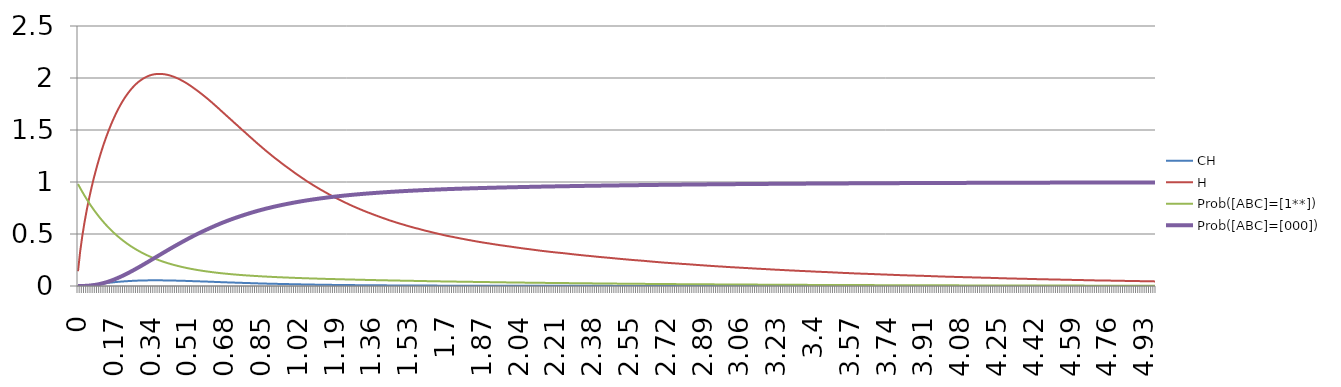
| Category | CH | H | Prob([ABC]=[1**]) | Prob([ABC]=[000]) |
|---|---|---|---|---|
| 0 | 0 | 0.142 | 0.98 | 0 |
| 0,01 | 0.001 | 0.332 | 0.942 | 0 |
| 0,02 | 0.002 | 0.482 | 0.905 | 0 |
| 0,03 | 0.004 | 0.611 | 0.87 | 0.001 |
| 0,04 | 0.005 | 0.726 | 0.836 | 0.002 |
| 0,05 | 0.008 | 0.829 | 0.803 | 0.003 |
| 0,06 | 0.01 | 0.924 | 0.772 | 0.005 |
| 0,07 | 0.012 | 1.012 | 0.742 | 0.008 |
| 0,08 | 0.015 | 1.093 | 0.713 | 0.011 |
| 0,09 | 0.018 | 1.169 | 0.685 | 0.015 |
| 0,1 | 0.02 | 1.241 | 0.659 | 0.019 |
| 0,11 | 0.023 | 1.308 | 0.634 | 0.024 |
| 0,12 | 0.025 | 1.371 | 0.61 | 0.029 |
| 0,13 | 0.028 | 1.43 | 0.586 | 0.035 |
| 0,14 | 0.03 | 1.486 | 0.564 | 0.042 |
| 0,15 | 0.033 | 1.539 | 0.543 | 0.049 |
| 0,16 | 0.035 | 1.588 | 0.523 | 0.057 |
| 0,17 | 0.037 | 1.634 | 0.503 | 0.065 |
| 0,18 | 0.039 | 1.677 | 0.484 | 0.074 |
| 0,19 | 0.041 | 1.718 | 0.467 | 0.083 |
| 0,2 | 0.043 | 1.755 | 0.45 | 0.092 |
| 0,21 | 0.044 | 1.79 | 0.433 | 0.102 |
| 0,22 | 0.046 | 1.822 | 0.418 | 0.112 |
| 0,23 | 0.047 | 1.851 | 0.403 | 0.123 |
| 0,24 | 0.048 | 1.878 | 0.389 | 0.134 |
| 0,25 | 0.049 | 1.903 | 0.375 | 0.145 |
| 0,26 | 0.05 | 1.926 | 0.362 | 0.156 |
| 0,27 | 0.051 | 1.946 | 0.349 | 0.168 |
| 0,28 | 0.052 | 1.964 | 0.338 | 0.179 |
| 0,29 | 0.052 | 1.979 | 0.326 | 0.191 |
| 0,3 | 0.053 | 1.993 | 0.315 | 0.203 |
| 0,31 | 0.054 | 2.005 | 0.305 | 0.215 |
| 0,32 | 0.054 | 2.015 | 0.295 | 0.228 |
| 0,33 | 0.054 | 2.023 | 0.285 | 0.24 |
| 0,34 | 0.054 | 2.03 | 0.276 | 0.252 |
| 0,35 | 0.055 | 2.035 | 0.267 | 0.265 |
| 0,36 | 0.054 | 2.038 | 0.259 | 0.277 |
| 0,37 | 0.054 | 2.039 | 0.251 | 0.29 |
| 0,38 | 0.054 | 2.039 | 0.244 | 0.302 |
| 0,39 | 0.054 | 2.038 | 0.236 | 0.314 |
| 0,4 | 0.054 | 2.036 | 0.229 | 0.327 |
| 0,41 | 0.054 | 2.032 | 0.223 | 0.339 |
| 0,42 | 0.053 | 2.027 | 0.216 | 0.351 |
| 0,43 | 0.053 | 2.021 | 0.21 | 0.363 |
| 0,44 | 0.052 | 2.014 | 0.204 | 0.375 |
| 0,45 | 0.052 | 2.005 | 0.199 | 0.387 |
| 0,46 | 0.051 | 1.997 | 0.193 | 0.399 |
| 0,47 | 0.051 | 1.986 | 0.188 | 0.41 |
| 0,48 | 0.05 | 1.976 | 0.183 | 0.422 |
| 0,49 | 0.05 | 1.964 | 0.179 | 0.433 |
| 0,5 | 0.049 | 1.952 | 0.174 | 0.444 |
| 0,51 | 0.048 | 1.938 | 0.17 | 0.456 |
| 0,52 | 0.048 | 1.925 | 0.166 | 0.467 |
| 0,53 | 0.047 | 1.91 | 0.162 | 0.478 |
| 0,54 | 0.046 | 1.895 | 0.158 | 0.488 |
| 0,55 | 0.046 | 1.88 | 0.154 | 0.498 |
| 0,56 | 0.045 | 1.864 | 0.151 | 0.509 |
| 0,57 | 0.044 | 1.848 | 0.148 | 0.519 |
| 0,58 | 0.043 | 1.831 | 0.144 | 0.529 |
| 0,59 | 0.043 | 1.815 | 0.142 | 0.538 |
| 0,6 | 0.042 | 1.798 | 0.139 | 0.548 |
| 0,61 | 0.041 | 1.78 | 0.136 | 0.557 |
| 0,62 | 0.04 | 1.762 | 0.133 | 0.566 |
| 0,63 | 0.04 | 1.743 | 0.13 | 0.576 |
| 0,64 | 0.039 | 1.725 | 0.128 | 0.585 |
| 0,65 | 0.038 | 1.706 | 0.126 | 0.593 |
| 0,66 | 0.037 | 1.687 | 0.123 | 0.602 |
| 0,67 | 0.036 | 1.668 | 0.121 | 0.611 |
| 0,68 | 0.036 | 1.65 | 0.119 | 0.619 |
| 0,69 | 0.035 | 1.63 | 0.117 | 0.627 |
| 0,7 | 0.034 | 1.612 | 0.115 | 0.635 |
| 0,71 | 0.034 | 1.593 | 0.113 | 0.642 |
| 0,72 | 0.033 | 1.574 | 0.111 | 0.65 |
| 0,73 | 0.032 | 1.555 | 0.11 | 0.657 |
| 0,74 | 0.032 | 1.537 | 0.108 | 0.664 |
| 0,75 | 0.031 | 1.517 | 0.106 | 0.671 |
| 0,76 | 0.03 | 1.499 | 0.105 | 0.678 |
| 0,77 | 0.029 | 1.48 | 0.103 | 0.685 |
| 0,78 | 0.029 | 1.462 | 0.102 | 0.691 |
| 0,79 | 0.028 | 1.442 | 0.1 | 0.698 |
| 0,8 | 0.027 | 1.424 | 0.099 | 0.704 |
| 0,81 | 0.027 | 1.406 | 0.098 | 0.71 |
| 0,82 | 0.026 | 1.387 | 0.096 | 0.717 |
| 0,83 | 0.025 | 1.368 | 0.095 | 0.723 |
| 0,84 | 0.025 | 1.351 | 0.094 | 0.728 |
| 0,85 | 0.024 | 1.333 | 0.093 | 0.734 |
| 0,86 | 0.024 | 1.315 | 0.091 | 0.739 |
| 0,87 | 0.023 | 1.297 | 0.09 | 0.745 |
| 0,88 | 0.022 | 1.281 | 0.089 | 0.75 |
| 0,89 | 0.022 | 1.264 | 0.088 | 0.755 |
| 0,9 | 0.021 | 1.246 | 0.087 | 0.76 |
| 0,91 | 0.021 | 1.23 | 0.086 | 0.765 |
| 0,92 | 0.02 | 1.214 | 0.085 | 0.769 |
| 0,93 | 0.02 | 1.198 | 0.084 | 0.774 |
| 0,94 | 0.02 | 1.182 | 0.083 | 0.778 |
| 0,95 | 0.019 | 1.166 | 0.082 | 0.783 |
| 0,96 | 0.019 | 1.151 | 0.082 | 0.787 |
| 0,97 | 0.018 | 1.136 | 0.081 | 0.791 |
| 0,98 | 0.018 | 1.12 | 0.08 | 0.795 |
| 0,99 | 0.017 | 1.105 | 0.079 | 0.799 |
| 1 | 0.017 | 1.09 | 0.078 | 0.803 |
| 1,01 | 0.016 | 1.075 | 0.078 | 0.807 |
| 1,02 | 0.016 | 1.061 | 0.077 | 0.81 |
| 1,03 | 0.016 | 1.046 | 0.076 | 0.814 |
| 1,04 | 0.015 | 1.032 | 0.075 | 0.817 |
| 1,05 | 0.015 | 1.018 | 0.074 | 0.821 |
| 1,06 | 0.014 | 1.004 | 0.074 | 0.824 |
| 1,07 | 0.014 | 0.992 | 0.073 | 0.827 |
| 1,08 | 0.014 | 0.978 | 0.072 | 0.83 |
| 1,09 | 0.013 | 0.965 | 0.072 | 0.834 |
| 1,1 | 0.013 | 0.953 | 0.071 | 0.836 |
| 1,11 | 0.013 | 0.94 | 0.071 | 0.839 |
| 1,12 | 0.012 | 0.928 | 0.07 | 0.842 |
| 1,13 | 0.012 | 0.916 | 0.069 | 0.845 |
| 1,14 | 0.012 | 0.904 | 0.069 | 0.848 |
| 1,15 | 0.012 | 0.893 | 0.068 | 0.85 |
| 1,16 | 0.011 | 0.881 | 0.068 | 0.853 |
| 1,17 | 0.011 | 0.87 | 0.067 | 0.855 |
| 1,18 | 0.011 | 0.858 | 0.066 | 0.858 |
| 1,19 | 0.01 | 0.847 | 0.066 | 0.86 |
| 1,2 | 0.01 | 0.837 | 0.065 | 0.863 |
| 1,21 | 0.01 | 0.827 | 0.065 | 0.865 |
| 1,22 | 0.01 | 0.816 | 0.064 | 0.867 |
| 1,23 | 0.009 | 0.806 | 0.064 | 0.869 |
| 1,24 | 0.009 | 0.797 | 0.063 | 0.871 |
| 1,25 | 0.009 | 0.787 | 0.063 | 0.873 |
| 1,26 | 0.009 | 0.777 | 0.062 | 0.875 |
| 1,27 | 0.009 | 0.768 | 0.062 | 0.877 |
| 1,28 | 0.008 | 0.759 | 0.061 | 0.879 |
| 1,29 | 0.008 | 0.75 | 0.061 | 0.881 |
| 1,3 | 0.008 | 0.741 | 0.06 | 0.883 |
| 1,31 | 0.008 | 0.732 | 0.06 | 0.885 |
| 1,32 | 0.008 | 0.724 | 0.059 | 0.886 |
| 1,33 | 0.007 | 0.715 | 0.059 | 0.888 |
| 1,34 | 0.007 | 0.707 | 0.058 | 0.89 |
| 1,35 | 0.007 | 0.699 | 0.058 | 0.891 |
| 1,36 | 0.007 | 0.691 | 0.057 | 0.893 |
| 1,37 | 0.007 | 0.683 | 0.057 | 0.894 |
| 1,38 | 0.007 | 0.675 | 0.056 | 0.896 |
| 1,39 | 0.007 | 0.668 | 0.056 | 0.897 |
| 1,4 | 0.006 | 0.66 | 0.056 | 0.899 |
| 1,41 | 0.006 | 0.653 | 0.055 | 0.9 |
| 1,42 | 0.006 | 0.646 | 0.055 | 0.902 |
| 1,43 | 0.006 | 0.638 | 0.054 | 0.903 |
| 1,44 | 0.006 | 0.631 | 0.054 | 0.905 |
| 1,45 | 0.006 | 0.624 | 0.053 | 0.906 |
| 1,46 | 0.006 | 0.618 | 0.053 | 0.907 |
| 1,47 | 0.006 | 0.611 | 0.052 | 0.908 |
| 1,48 | 0.005 | 0.604 | 0.052 | 0.91 |
| 1,49 | 0.005 | 0.598 | 0.052 | 0.911 |
| 1,5 | 0.005 | 0.592 | 0.051 | 0.912 |
| 1,51 | 0.005 | 0.586 | 0.051 | 0.913 |
| 1,52 | 0.005 | 0.58 | 0.05 | 0.914 |
| 1,53 | 0.005 | 0.574 | 0.05 | 0.915 |
| 1,54 | 0.005 | 0.568 | 0.05 | 0.916 |
| 1,55 | 0.004 | 0.562 | 0.049 | 0.917 |
| 1,56 | 0.004 | 0.556 | 0.049 | 0.918 |
| 1,57 | 0.004 | 0.552 | 0.048 | 0.919 |
| 1,58 | 0.004 | 0.546 | 0.048 | 0.92 |
| 1,59 | 0.004 | 0.54 | 0.048 | 0.921 |
| 1,6 | 0.004 | 0.534 | 0.047 | 0.922 |
| 1,61 | 0.004 | 0.529 | 0.047 | 0.923 |
| 1,62 | 0.004 | 0.524 | 0.046 | 0.924 |
| 1,63 | 0.004 | 0.52 | 0.046 | 0.925 |
| 1,64 | 0.004 | 0.514 | 0.046 | 0.926 |
| 1,65 | 0.004 | 0.509 | 0.045 | 0.927 |
| 1,66 | 0.004 | 0.504 | 0.045 | 0.928 |
| 1,67 | 0.004 | 0.499 | 0.045 | 0.929 |
| 1,68 | 0.004 | 0.495 | 0.044 | 0.929 |
| 1,69 | 0.003 | 0.49 | 0.044 | 0.93 |
| 1,7 | 0.003 | 0.485 | 0.044 | 0.931 |
| 1,71 | 0.003 | 0.48 | 0.043 | 0.932 |
| 1,72 | 0.003 | 0.476 | 0.043 | 0.932 |
| 1,73 | 0.003 | 0.472 | 0.043 | 0.933 |
| 1,74 | 0.003 | 0.468 | 0.042 | 0.934 |
| 1,75 | 0.003 | 0.464 | 0.042 | 0.935 |
| 1,76 | 0.003 | 0.46 | 0.042 | 0.935 |
| 1,77 | 0.003 | 0.456 | 0.041 | 0.936 |
| 1,78 | 0.003 | 0.452 | 0.041 | 0.937 |
| 1,79 | 0.003 | 0.448 | 0.041 | 0.937 |
| 1,8 | 0.003 | 0.444 | 0.04 | 0.938 |
| 1,81 | 0.003 | 0.44 | 0.04 | 0.939 |
| 1,82 | 0.003 | 0.436 | 0.04 | 0.939 |
| 1,83 | 0.003 | 0.433 | 0.04 | 0.94 |
| 1,84 | 0.003 | 0.429 | 0.039 | 0.941 |
| 1,85 | 0.003 | 0.425 | 0.039 | 0.941 |
| 1,86 | 0.002 | 0.422 | 0.039 | 0.942 |
| 1,87 | 0.002 | 0.418 | 0.038 | 0.942 |
| 1,88 | 0.002 | 0.415 | 0.038 | 0.943 |
| 1,89 | 0.002 | 0.412 | 0.038 | 0.944 |
| 1,9 | 0.002 | 0.409 | 0.037 | 0.944 |
| 1,91 | 0.002 | 0.405 | 0.037 | 0.945 |
| 1,92 | 0.002 | 0.402 | 0.037 | 0.945 |
| 1,93 | 0.002 | 0.399 | 0.036 | 0.946 |
| 1,94 | 0.002 | 0.396 | 0.036 | 0.946 |
| 1,95 | 0.002 | 0.392 | 0.036 | 0.947 |
| 1,96 | 0.002 | 0.39 | 0.035 | 0.947 |
| 1,97 | 0.002 | 0.387 | 0.035 | 0.948 |
| 1,98 | 0.002 | 0.384 | 0.035 | 0.948 |
| 1,99 | 0.002 | 0.381 | 0.034 | 0.949 |
| 2 | 0.002 | 0.378 | 0.034 | 0.949 |
| 2,01 | 0.002 | 0.375 | 0.034 | 0.95 |
| 2,02 | 0.002 | 0.372 | 0.034 | 0.95 |
| 2,03 | 0.002 | 0.369 | 0.033 | 0.951 |
| 2,04 | 0.002 | 0.366 | 0.033 | 0.951 |
| 2,05 | 0.002 | 0.363 | 0.033 | 0.952 |
| 2,06 | 0.002 | 0.36 | 0.032 | 0.952 |
| 2,07 | 0.002 | 0.358 | 0.032 | 0.952 |
| 2,08 | 0.002 | 0.355 | 0.032 | 0.953 |
| 2,09 | 0.002 | 0.352 | 0.032 | 0.953 |
| 2,1 | 0.002 | 0.35 | 0.032 | 0.954 |
| 2,11 | 0.002 | 0.347 | 0.031 | 0.954 |
| 2,12 | 0.002 | 0.344 | 0.031 | 0.955 |
| 2,13 | 0.002 | 0.341 | 0.031 | 0.955 |
| 2,14 | 0.002 | 0.339 | 0.03 | 0.956 |
| 2,15 | 0.002 | 0.336 | 0.03 | 0.956 |
| 2,16 | 0.002 | 0.334 | 0.03 | 0.956 |
| 2,17 | 0.002 | 0.331 | 0.03 | 0.957 |
| 2,18 | 0.002 | 0.329 | 0.03 | 0.957 |
| 2,19 | 0.002 | 0.327 | 0.029 | 0.957 |
| 2,2 | 0.002 | 0.324 | 0.029 | 0.958 |
| 2,21 | 0.002 | 0.322 | 0.029 | 0.958 |
| 2,22 | 0.002 | 0.32 | 0.029 | 0.958 |
| 2,23 | 0.002 | 0.318 | 0.028 | 0.959 |
| 2,24 | 0.002 | 0.316 | 0.028 | 0.959 |
| 2,25 | 0.002 | 0.314 | 0.028 | 0.96 |
| 2,26 | 0.002 | 0.312 | 0.028 | 0.96 |
| 2,27 | 0.002 | 0.309 | 0.028 | 0.96 |
| 2,28 | 0.002 | 0.307 | 0.027 | 0.961 |
| 2,29 | 0.002 | 0.304 | 0.027 | 0.961 |
| 2,3 | 0.002 | 0.302 | 0.027 | 0.961 |
| 2,31 | 0.002 | 0.3 | 0.027 | 0.962 |
| 2,32 | 0.001 | 0.298 | 0.026 | 0.962 |
| 2,33 | 0.001 | 0.296 | 0.026 | 0.962 |
| 2,34 | 0.001 | 0.293 | 0.026 | 0.963 |
| 2,35 | 0.001 | 0.291 | 0.026 | 0.963 |
| 2,36 | 0.001 | 0.29 | 0.026 | 0.963 |
| 2,37 | 0.001 | 0.288 | 0.025 | 0.964 |
| 2,38 | 0.001 | 0.285 | 0.025 | 0.964 |
| 2,39 | 0.001 | 0.283 | 0.025 | 0.964 |
| 2,4 | 0.001 | 0.281 | 0.025 | 0.965 |
| 2,41 | 0.001 | 0.279 | 0.024 | 0.965 |
| 2,42 | 0.001 | 0.277 | 0.024 | 0.965 |
| 2,43 | 0.001 | 0.275 | 0.024 | 0.965 |
| 2,44 | 0.001 | 0.274 | 0.024 | 0.966 |
| 2,45 | 0.001 | 0.272 | 0.024 | 0.966 |
| 2,46 | 0.001 | 0.27 | 0.023 | 0.966 |
| 2,47 | 0.001 | 0.268 | 0.023 | 0.967 |
| 2,48 | 0.001 | 0.266 | 0.023 | 0.967 |
| 2,49 | 0.001 | 0.264 | 0.023 | 0.967 |
| 2,5 | 0.001 | 0.262 | 0.023 | 0.968 |
| 2,51 | 0.001 | 0.26 | 0.022 | 0.968 |
| 2,52 | 0.001 | 0.258 | 0.022 | 0.968 |
| 2,53 | 0.001 | 0.256 | 0.022 | 0.968 |
| 2,54 | 0.001 | 0.254 | 0.022 | 0.969 |
| 2,55 | 0.001 | 0.252 | 0.022 | 0.969 |
| 2,56 | 0.001 | 0.251 | 0.022 | 0.969 |
| 2,57 | 0.001 | 0.249 | 0.021 | 0.969 |
| 2,58 | 0.001 | 0.247 | 0.021 | 0.97 |
| 2,59 | 0.001 | 0.246 | 0.021 | 0.97 |
| 2,6 | 0.001 | 0.244 | 0.021 | 0.97 |
| 2,61 | 0.001 | 0.243 | 0.021 | 0.97 |
| 2,62 | 0.001 | 0.241 | 0.02 | 0.971 |
| 2,63 | 0.001 | 0.239 | 0.02 | 0.971 |
| 2,64 | 0.001 | 0.237 | 0.02 | 0.971 |
| 2,65 | 0.001 | 0.235 | 0.02 | 0.972 |
| 2,66 | 0.001 | 0.233 | 0.02 | 0.972 |
| 2,67 | 0.001 | 0.231 | 0.02 | 0.972 |
| 2,68 | 0.001 | 0.23 | 0.019 | 0.972 |
| 2,69 | 0.001 | 0.228 | 0.019 | 0.973 |
| 2,7 | 0.001 | 0.226 | 0.019 | 0.973 |
| 2,71 | 0.001 | 0.224 | 0.019 | 0.973 |
| 2,72 | 0.001 | 0.223 | 0.019 | 0.973 |
| 2,73 | 0.001 | 0.222 | 0.019 | 0.973 |
| 2,74 | 0.001 | 0.22 | 0.018 | 0.974 |
| 2,75 | 0.001 | 0.219 | 0.018 | 0.974 |
| 2,76 | 0.001 | 0.217 | 0.018 | 0.974 |
| 2,77 | 0.001 | 0.216 | 0.018 | 0.974 |
| 2,78 | 0.001 | 0.214 | 0.018 | 0.975 |
| 2,79 | 0.001 | 0.213 | 0.018 | 0.975 |
| 2,8 | 0.001 | 0.212 | 0.017 | 0.975 |
| 2,81 | 0.001 | 0.21 | 0.017 | 0.975 |
| 2,82 | 0.001 | 0.209 | 0.017 | 0.975 |
| 2,83 | 0.001 | 0.207 | 0.017 | 0.976 |
| 2,84 | 0.001 | 0.206 | 0.017 | 0.976 |
| 2,85 | 0.001 | 0.204 | 0.017 | 0.976 |
| 2,86 | 0.001 | 0.202 | 0.017 | 0.976 |
| 2,87 | 0.001 | 0.201 | 0.016 | 0.976 |
| 2,88 | 0.001 | 0.2 | 0.016 | 0.977 |
| 2,89 | 0.001 | 0.198 | 0.016 | 0.977 |
| 2,9 | 0.001 | 0.197 | 0.016 | 0.977 |
| 2,91 | 0.001 | 0.195 | 0.016 | 0.977 |
| 2,92 | 0.001 | 0.194 | 0.016 | 0.977 |
| 2,93 | 0.001 | 0.192 | 0.016 | 0.978 |
| 2,94 | 0.001 | 0.191 | 0.016 | 0.978 |
| 2,95 | 0.001 | 0.19 | 0.015 | 0.978 |
| 2,96 | 0.001 | 0.188 | 0.015 | 0.978 |
| 2,97 | 0.001 | 0.187 | 0.015 | 0.978 |
| 2,98 | 0.001 | 0.186 | 0.015 | 0.979 |
| 2,99 | 0.001 | 0.184 | 0.015 | 0.979 |
| 3 | 0.001 | 0.183 | 0.015 | 0.979 |
| 3,01 | 0.001 | 0.182 | 0.015 | 0.979 |
| 3,02 | 0.001 | 0.181 | 0.014 | 0.979 |
| 3,03 | 0.001 | 0.18 | 0.014 | 0.979 |
| 3,04 | 0.001 | 0.178 | 0.014 | 0.98 |
| 3,05 | 0.001 | 0.177 | 0.014 | 0.98 |
| 3,06 | 0.001 | 0.176 | 0.014 | 0.98 |
| 3,07 | 0.001 | 0.175 | 0.014 | 0.98 |
| 3,08 | 0.001 | 0.174 | 0.014 | 0.98 |
| 3,09 | 0.001 | 0.172 | 0.014 | 0.98 |
| 3,1 | 0.001 | 0.171 | 0.014 | 0.981 |
| 3,11 | 0.001 | 0.17 | 0.014 | 0.981 |
| 3,12 | 0.001 | 0.169 | 0.013 | 0.981 |
| 3,13 | 0.001 | 0.168 | 0.013 | 0.981 |
| 3,14 | 0.001 | 0.166 | 0.013 | 0.981 |
| 3,15 | 0.001 | 0.165 | 0.013 | 0.981 |
| 3,16 | 0.001 | 0.164 | 0.013 | 0.982 |
| 3,17 | 0.001 | 0.163 | 0.013 | 0.982 |
| 3,18 | 0.001 | 0.162 | 0.013 | 0.982 |
| 3,19 | 0.001 | 0.161 | 0.013 | 0.982 |
| 3,2 | 0.001 | 0.16 | 0.012 | 0.982 |
| 3,21 | 0.001 | 0.158 | 0.012 | 0.982 |
| 3,22 | 0.001 | 0.157 | 0.012 | 0.982 |
| 3,23 | 0.001 | 0.156 | 0.012 | 0.983 |
| 3,24 | 0.001 | 0.155 | 0.012 | 0.983 |
| 3,25 | 0.001 | 0.154 | 0.012 | 0.983 |
| 3,26 | 0.001 | 0.153 | 0.012 | 0.983 |
| 3,27 | 0.001 | 0.152 | 0.012 | 0.983 |
| 3,28 | 0.001 | 0.151 | 0.012 | 0.983 |
| 3,29 | 0.001 | 0.15 | 0.012 | 0.983 |
| 3,3 | 0.001 | 0.149 | 0.012 | 0.984 |
| 3,31 | 0.001 | 0.148 | 0.011 | 0.984 |
| 3,32 | 0.001 | 0.147 | 0.011 | 0.984 |
| 3,33 | 0.001 | 0.146 | 0.011 | 0.984 |
| 3,34 | 0.001 | 0.145 | 0.011 | 0.984 |
| 3,35 | 0.001 | 0.144 | 0.011 | 0.984 |
| 3,36 | 0.001 | 0.143 | 0.011 | 0.984 |
| 3,37 | 0.001 | 0.142 | 0.011 | 0.984 |
| 3,38 | 0.001 | 0.141 | 0.011 | 0.985 |
| 3,39 | 0.001 | 0.14 | 0.011 | 0.985 |
| 3,4 | 0.001 | 0.139 | 0.01 | 0.985 |
| 3,41 | 0 | 0.138 | 0.01 | 0.985 |
| 3,42 | 0.001 | 0.137 | 0.01 | 0.985 |
| 3,43 | 0.001 | 0.136 | 0.01 | 0.985 |
| 3,44 | 0 | 0.135 | 0.01 | 0.985 |
| 3,45 | 0 | 0.134 | 0.01 | 0.985 |
| 3,46 | 0.001 | 0.134 | 0.01 | 0.986 |
| 3,47 | 0.001 | 0.133 | 0.01 | 0.986 |
| 3,48 | 0 | 0.132 | 0.01 | 0.986 |
| 3,49 | 0 | 0.131 | 0.01 | 0.986 |
| 3,5 | 0 | 0.13 | 0.01 | 0.986 |
| 3,51 | 0 | 0.129 | 0.01 | 0.986 |
| 3,52 | 0 | 0.128 | 0.01 | 0.986 |
| 3,53 | 0 | 0.126 | 0.01 | 0.986 |
| 3,54 | 0 | 0.126 | 0.009 | 0.987 |
| 3,55 | 0 | 0.125 | 0.009 | 0.987 |
| 3,56 | 0 | 0.124 | 0.009 | 0.987 |
| 3,57 | 0 | 0.123 | 0.009 | 0.987 |
| 3,58 | 0 | 0.122 | 0.009 | 0.987 |
| 3,59 | 0 | 0.121 | 0.009 | 0.987 |
| 3,6 | 0 | 0.12 | 0.009 | 0.987 |
| 3,61 | 0 | 0.119 | 0.009 | 0.987 |
| 3,62 | 0 | 0.119 | 0.009 | 0.987 |
| 3,63 | 0 | 0.118 | 0.009 | 0.988 |
| 3,64 | 0 | 0.117 | 0.009 | 0.988 |
| 3,65 | 0 | 0.116 | 0.009 | 0.988 |
| 3,66 | 0 | 0.116 | 0.008 | 0.988 |
| 3,67 | 0 | 0.115 | 0.008 | 0.988 |
| 3,68 | 0 | 0.114 | 0.008 | 0.988 |
| 3,69 | 0 | 0.113 | 0.008 | 0.988 |
| 3,7 | 0 | 0.112 | 0.008 | 0.988 |
| 3,71 | 0 | 0.112 | 0.008 | 0.988 |
| 3,72 | 0 | 0.111 | 0.008 | 0.988 |
| 3,73 | 0 | 0.11 | 0.008 | 0.989 |
| 3,74 | 0 | 0.109 | 0.008 | 0.989 |
| 3,75 | 0 | 0.108 | 0.008 | 0.989 |
| 3,76 | 0 | 0.108 | 0.008 | 0.989 |
| 3,77 | 0 | 0.107 | 0.008 | 0.989 |
| 3,78 | 0 | 0.106 | 0.008 | 0.989 |
| 3,79 | 0 | 0.105 | 0.008 | 0.989 |
| 3,8 | 0 | 0.104 | 0.008 | 0.989 |
| 3,81 | 0 | 0.104 | 0.008 | 0.989 |
| 3,82 | 0 | 0.103 | 0.007 | 0.989 |
| 3,83 | 0 | 0.102 | 0.007 | 0.989 |
| 3,84 | 0 | 0.102 | 0.007 | 0.99 |
| 3,85 | 0 | 0.101 | 0.007 | 0.99 |
| 3,86 | 0 | 0.1 | 0.007 | 0.99 |
| 3,87 | 0 | 0.1 | 0.007 | 0.99 |
| 3,88 | 0 | 0.099 | 0.007 | 0.99 |
| 3,89 | 0 | 0.099 | 0.007 | 0.99 |
| 3,9 | 0 | 0.098 | 0.007 | 0.99 |
| 3,91 | 0 | 0.097 | 0.007 | 0.99 |
| 3,92 | 0 | 0.097 | 0.007 | 0.99 |
| 3,93 | 0 | 0.096 | 0.007 | 0.99 |
| 3,94 | 0 | 0.095 | 0.007 | 0.99 |
| 3,95 | 0 | 0.094 | 0.007 | 0.99 |
| 3,96 | 0 | 0.094 | 0.007 | 0.991 |
| 3,97 | 0 | 0.093 | 0.007 | 0.991 |
| 3,98 | 0 | 0.092 | 0.006 | 0.991 |
| 3,99 | 0 | 0.091 | 0.006 | 0.991 |
| 4 | 0 | 0.09 | 0.006 | 0.991 |
| 4,01 | 0 | 0.09 | 0.006 | 0.991 |
| 4,02 | 0 | 0.089 | 0.006 | 0.991 |
| 4,03 | 0 | 0.089 | 0.006 | 0.991 |
| 4,04 | 0 | 0.088 | 0.006 | 0.991 |
| 4,05 | 0 | 0.088 | 0.006 | 0.991 |
| 4,06 | 0 | 0.087 | 0.006 | 0.991 |
| 4,07 | 0 | 0.086 | 0.006 | 0.991 |
| 4,08 | 0 | 0.086 | 0.006 | 0.991 |
| 4,09 | 0 | 0.085 | 0.006 | 0.991 |
| 4,1 | 0 | 0.085 | 0.006 | 0.992 |
| 4,11 | 0 | 0.084 | 0.006 | 0.992 |
| 4,12 | 0 | 0.084 | 0.006 | 0.992 |
| 4,13 | 0 | 0.083 | 0.006 | 0.992 |
| 4,14 | 0 | 0.082 | 0.006 | 0.992 |
| 4,15 | 0 | 0.082 | 0.006 | 0.992 |
| 4,16 | 0 | 0.081 | 0.006 | 0.992 |
| 4,17 | 0 | 0.081 | 0.006 | 0.992 |
| 4,18 | 0 | 0.08 | 0.006 | 0.992 |
| 4,19 | 0 | 0.08 | 0.005 | 0.992 |
| 4,2 | 0 | 0.079 | 0.005 | 0.992 |
| 4,21 | 0 | 0.078 | 0.005 | 0.992 |
| 4,22 | 0 | 0.078 | 0.005 | 0.992 |
| 4,23 | 0 | 0.077 | 0.005 | 0.992 |
| 4,24 | 0 | 0.076 | 0.005 | 0.992 |
| 4,25 | 0 | 0.076 | 0.005 | 0.993 |
| 4,26 | 0 | 0.075 | 0.005 | 0.993 |
| 4,27 | 0 | 0.074 | 0.005 | 0.993 |
| 4,28 | 0 | 0.074 | 0.005 | 0.993 |
| 4,29 | 0 | 0.073 | 0.005 | 0.993 |
| 4,3 | 0 | 0.073 | 0.005 | 0.993 |
| 4,31 | 0 | 0.072 | 0.005 | 0.993 |
| 4,32 | 0 | 0.072 | 0.005 | 0.993 |
| 4,33 | 0 | 0.071 | 0.005 | 0.993 |
| 4,34 | 0 | 0.071 | 0.005 | 0.993 |
| 4,35 | 0 | 0.07 | 0.005 | 0.993 |
| 4,36 | 0 | 0.07 | 0.005 | 0.993 |
| 4,37 | 0 | 0.069 | 0.005 | 0.993 |
| 4,38 | 0 | 0.069 | 0.005 | 0.993 |
| 4,39 | 0 | 0.068 | 0.005 | 0.993 |
| 4,4 | 0 | 0.068 | 0.005 | 0.994 |
| 4,41 | 0 | 0.067 | 0.004 | 0.994 |
| 4,42 | 0 | 0.066 | 0.004 | 0.994 |
| 4,43 | 0 | 0.066 | 0.004 | 0.994 |
| 4,44 | 0 | 0.066 | 0.004 | 0.994 |
| 4,45 | 0 | 0.065 | 0.004 | 0.994 |
| 4,46 | 0 | 0.065 | 0.004 | 0.994 |
| 4,47 | 0 | 0.064 | 0.004 | 0.994 |
| 4,48 | 0 | 0.064 | 0.004 | 0.994 |
| 4,49 | 0 | 0.063 | 0.004 | 0.994 |
| 4,5 | 0 | 0.063 | 0.004 | 0.994 |
| 4,51 | 0 | 0.062 | 0.004 | 0.994 |
| 4,52 | 0 | 0.062 | 0.004 | 0.994 |
| 4,53 | 0 | 0.062 | 0.004 | 0.994 |
| 4,54 | 0 | 0.061 | 0.004 | 0.994 |
| 4,55 | 0 | 0.061 | 0.004 | 0.994 |
| 4,56 | 0 | 0.06 | 0.004 | 0.994 |
| 4,57 | 0 | 0.06 | 0.004 | 0.994 |
| 4,58 | 0 | 0.059 | 0.004 | 0.994 |
| 4,59 | 0 | 0.059 | 0.004 | 0.994 |
| 4,6 | 0 | 0.058 | 0.004 | 0.995 |
| 4,61 | 0 | 0.058 | 0.004 | 0.995 |
| 4,62 | 0 | 0.058 | 0.004 | 0.995 |
| 4,63 | 0 | 0.057 | 0.004 | 0.995 |
| 4,64 | 0 | 0.057 | 0.004 | 0.995 |
| 4,65 | 0 | 0.056 | 0.004 | 0.995 |
| 4,66 | 0 | 0.056 | 0.004 | 0.995 |
| 4,67 | 0 | 0.055 | 0.004 | 0.995 |
| 4,68 | 0 | 0.055 | 0.004 | 0.995 |
| 4,69 | 0 | 0.054 | 0.004 | 0.995 |
| 4,7 | 0 | 0.054 | 0.004 | 0.995 |
| 4,71 | 0 | 0.054 | 0.004 | 0.995 |
| 4,72 | 0 | 0.053 | 0.003 | 0.995 |
| 4,73 | 0 | 0.053 | 0.003 | 0.995 |
| 4,74 | 0 | 0.053 | 0.003 | 0.995 |
| 4,75 | 0 | 0.052 | 0.003 | 0.995 |
| 4,76 | 0 | 0.052 | 0.003 | 0.995 |
| 4,77 | 0 | 0.052 | 0.003 | 0.995 |
| 4,78 | 0 | 0.051 | 0.003 | 0.995 |
| 4,79 | 0 | 0.051 | 0.003 | 0.995 |
| 4,8 | 0 | 0.051 | 0.003 | 0.995 |
| 4,81 | 0 | 0.05 | 0.003 | 0.995 |
| 4,82 | 0 | 0.05 | 0.003 | 0.995 |
| 4,83 | 0 | 0.05 | 0.003 | 0.995 |
| 4,84 | 0 | 0.049 | 0.003 | 0.996 |
| 4,85 | 0 | 0.049 | 0.003 | 0.996 |
| 4,86 | 0 | 0.048 | 0.003 | 0.996 |
| 4,87 | 0 | 0.048 | 0.003 | 0.996 |
| 4,88 | 0 | 0.048 | 0.003 | 0.996 |
| 4,89 | 0 | 0.047 | 0.003 | 0.996 |
| 4,9 | 0 | 0.047 | 0.003 | 0.996 |
| 4,91 | 0 | 0.047 | 0.003 | 0.996 |
| 4,92 | 0 | 0.046 | 0.003 | 0.996 |
| 4,93 | 0 | 0.046 | 0.003 | 0.996 |
| 4,94 | 0 | 0.046 | 0.003 | 0.996 |
| 4,95 | 0 | 0.045 | 0.003 | 0.996 |
| 4,96 | 0 | 0.045 | 0.003 | 0.996 |
| 4,97 | 0 | 0.044 | 0.003 | 0.996 |
| 4,98 | 0 | 0.044 | 0.003 | 0.996 |